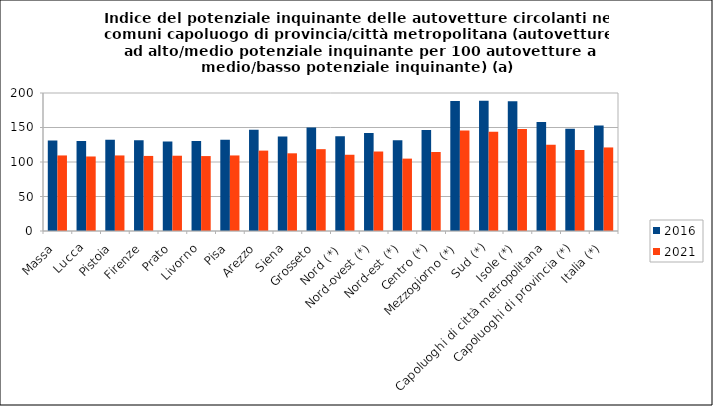
| Category | 2016 | 2021 |
|---|---|---|
| Massa | 131.1 | 109.5 |
| Lucca | 130.5 | 108 |
| Pistoia | 132.4 | 109.5 |
| Firenze | 131.6 | 108.8 |
| Prato | 129.8 | 109.1 |
| Livorno | 130.4 | 108.6 |
| Pisa | 132.2 | 109.5 |
| Arezzo | 146.7 | 116.5 |
| Siena | 136.9 | 112.6 |
| Grosseto | 150.1 | 118.6 |
| Nord (*)  | 137.5 | 110.5 |
| Nord-ovest (*) | 142.1 | 115.2 |
| Nord-est (*) | 131.6 | 104.9 |
| Centro (*) | 146.4 | 114.5 |
| Mezzogiorno (*) | 188.5 | 145.5 |
| Sud (*) | 188.8 | 144 |
| Isole (*) | 188 | 147.9 |
| Capoluoghi di città metropolitana | 158.1 | 125 |
| Capoluoghi di provincia (*) | 148.1 | 117.4 |
| Italia (*) | 153 | 121.1 |